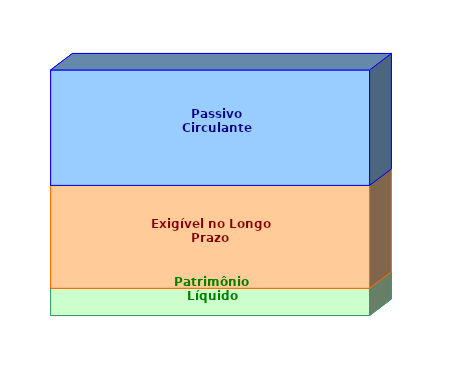
| Category | Patrimônio Líquido | Exigível no Longo Prazo | Passivo Circulante |
|---|---|---|---|
| 0 | 0.111 | 0.419 | 0.47 |